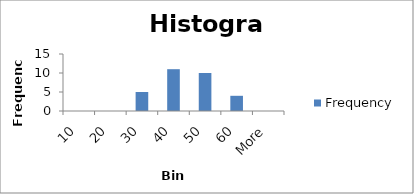
| Category | Frequency |
|---|---|
| 10 | 0 |
| 20 | 0 |
| 30 | 5 |
| 40 | 11 |
| 50 | 10 |
| 60 | 4 |
| More | 0 |